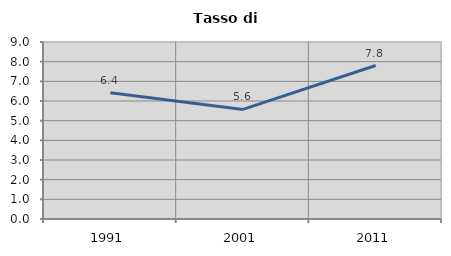
| Category | Tasso di disoccupazione   |
|---|---|
| 1991.0 | 6.421 |
| 2001.0 | 5.573 |
| 2011.0 | 7.803 |